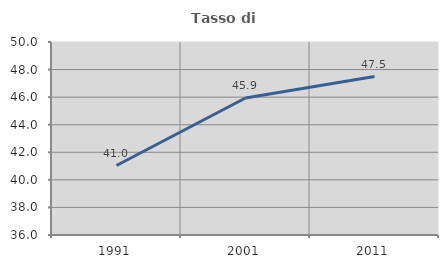
| Category | Tasso di occupazione   |
|---|---|
| 1991.0 | 41.039 |
| 2001.0 | 45.94 |
| 2011.0 | 47.494 |